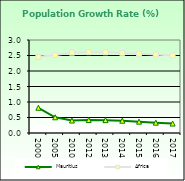
| Category | Mauritius | Africa  |
|---|---|---|
| 2000.0 | 0.814 | 2.458 |
| 2005.0 | 0.508 | 2.516 |
| 2010.0 | 0.402 | 2.59 |
| 2012.0 | 0.419 | 2.606 |
| 2013.0 | 0.415 | 2.601 |
| 2014.0 | 0.396 | 2.584 |
| 2015.0 | 0.366 | 2.559 |
| 2016.0 | 0.334 | 2.531 |
| 2017.0 | 0.305 | 2.503 |